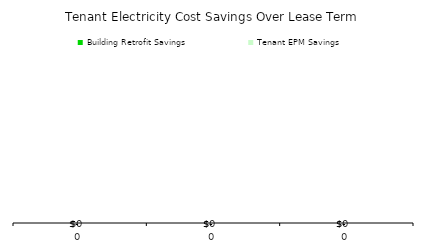
| Category | Building Retrofit Savings | Tenant EPM Savings |
|---|---|---|
| 0.0 | 0 | 0 |
| 0.0 | 0 | 0 |
| 0.0 | 0 | 0 |